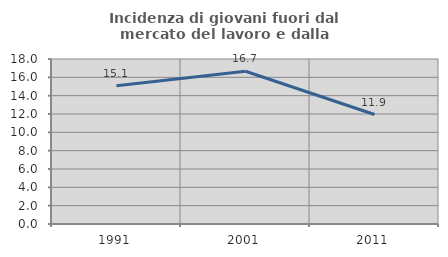
| Category | Incidenza di giovani fuori dal mercato del lavoro e dalla formazione  |
|---|---|
| 1991.0 | 15.078 |
| 2001.0 | 16.667 |
| 2011.0 | 11.944 |